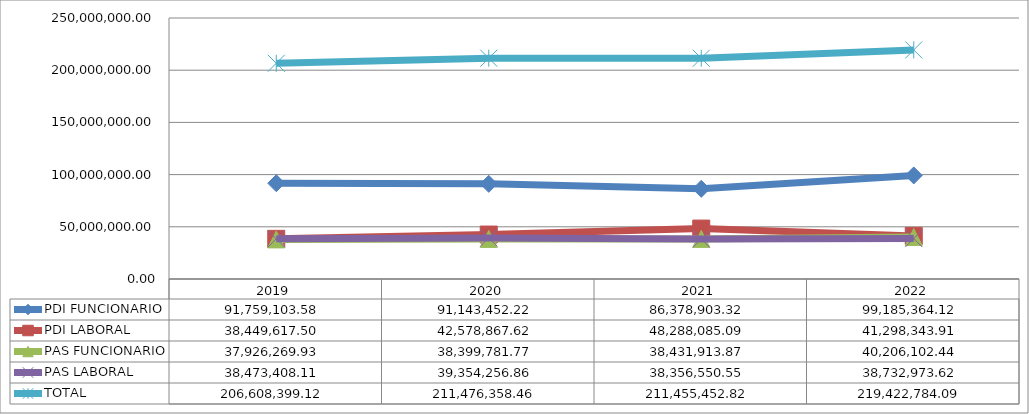
| Category | PDI FUNCIONARIO | PDI LABORAL | PAS FUNCIONARIO | PAS LABORAL | TOTAL |
|---|---|---|---|---|---|
| 2019 | 91759103.578 | 38449617.503 | 37926269.931 | 38473408.109 | 206608399.12 |
| 2020 | 91143452.217 | 42578867.621 | 38399781.765 | 39354256.856 | 211476358.46 |
| 2021 | 86378903.315 | 48288085.087 | 38431913.868 | 38356550.55 | 211455452.82 |
| 2022 | 99185364.122 | 41298343.908 | 40206102.445 | 38732973.615 | 219422784.09 |